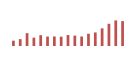
| Category | Importações (2) |
|---|---|
| 0 | 575.605 |
| 1 | 741.035 |
| 2 | 1388.881 |
| 3 | 899.436 |
| 4 | 1170.349 |
| 5 | 1022.737 |
| 6 | 1030.066 |
| 7 | 1010.02 |
| 8 | 1183.202 |
| 9 | 1121.55 |
| 10 | 1027.2 |
| 11 | 1322.664 |
| 12 | 1463.875 |
| 13 | 1908.09 |
| 14 | 2403.679 |
| 15 | 2765.16 |
| 16 | 2691.03 |